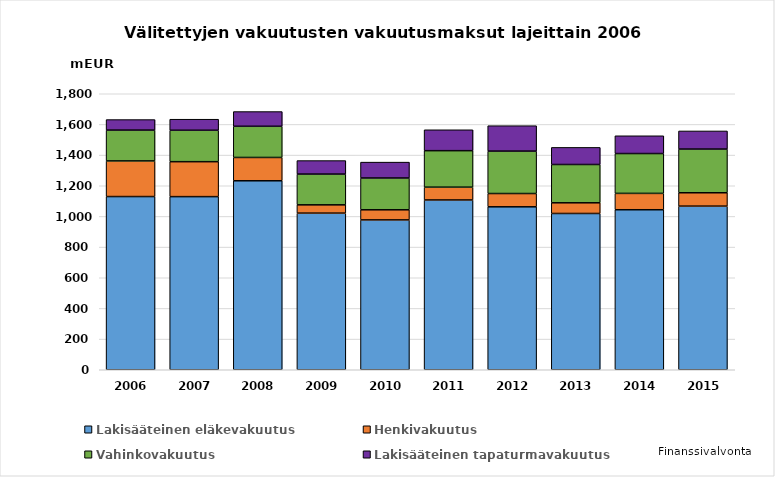
| Category | Lakisääteinen eläkevakuutus | Henkivakuutus | Vahinkovakuutus | Lakisääteinen tapaturmavakuutus |
|---|---|---|---|---|
| 2006.0 | 1129.49 | 232.47 | 201.056 | 68.612 |
| 2007.0 | 1129 | 228 | 205 | 72 |
| 2008.0 | 1232.449 | 151.996 | 203.425 | 95.962 |
| 2009.0 | 1021.457 | 54.107 | 200.56 | 88.041 |
| 2010.0 | 977.321 | 65.95 | 207.341 | 103.558 |
| 2011.0 | 1107.329 | 83.403 | 238.041 | 136.289 |
| 2012.0 | 1062.705 | 86.597 | 276.62 | 165.706 |
| 2013.0 | 1019.216 | 69.648 | 249.823 | 111.515 |
| 2014.0 | 1043.573 | 106.619 | 259.835 | 115.957 |
| 2015.0 | 1067.062 | 87.285 | 284.943 | 118.153 |